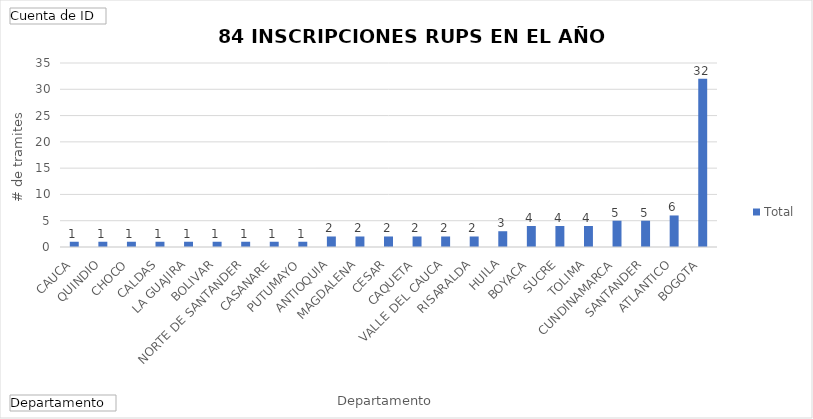
| Category | Total |
|---|---|
| CAUCA | 1 |
| QUINDIO | 1 |
| CHOCO | 1 |
| CALDAS | 1 |
| LA GUAJIRA | 1 |
| BOLIVAR | 1 |
| NORTE DE SANTANDER | 1 |
| CASANARE | 1 |
| PUTUMAYO | 1 |
| ANTIOQUIA | 2 |
| MAGDALENA | 2 |
| CESAR | 2 |
| CAQUETA | 2 |
| VALLE DEL CAUCA | 2 |
| RISARALDA | 2 |
| HUILA | 3 |
| BOYACA | 4 |
| SUCRE | 4 |
| TOLIMA | 4 |
| CUNDINAMARCA | 5 |
| SANTANDER | 5 |
| ATLANTICO | 6 |
| BOGOTA, D.C. | 32 |